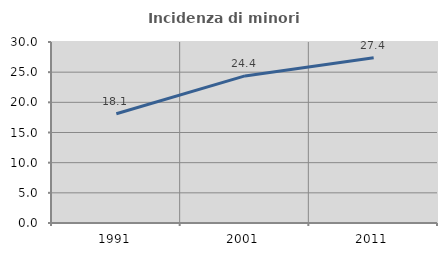
| Category | Incidenza di minori stranieri |
|---|---|
| 1991.0 | 18.103 |
| 2001.0 | 24.378 |
| 2011.0 | 27.389 |